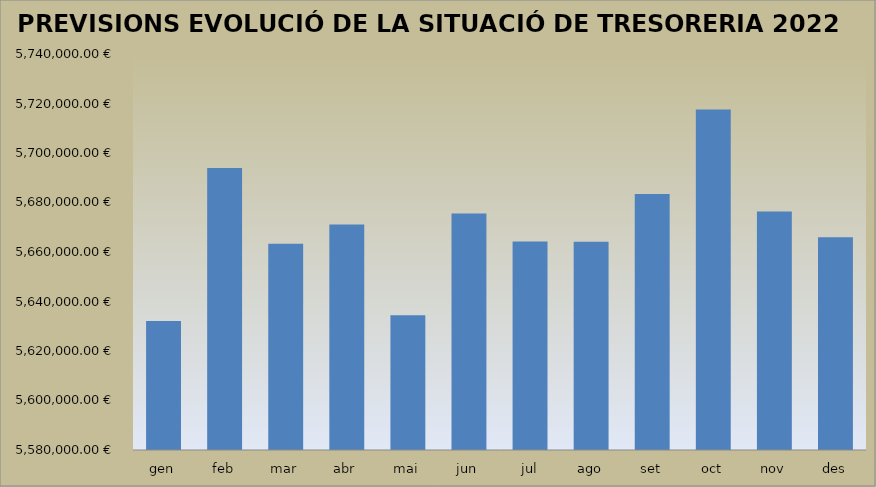
| Category | PREVISIÓ RESUM ANUAL TRESORERIA 2022 |
|---|---|
| gen | 5632105.84 |
| feb | 5693978.03 |
| mar | 5663289.99 |
| abr | 5671069.74 |
| mai | 5634400.36 |
| jun | 5675510.35 |
| jul | 5664230.89 |
| ago | 5664091.48 |
| set | 5683477.18 |
| oct | 5717546.86 |
| nov | 5676384.24 |
| des | 5665922.97 |